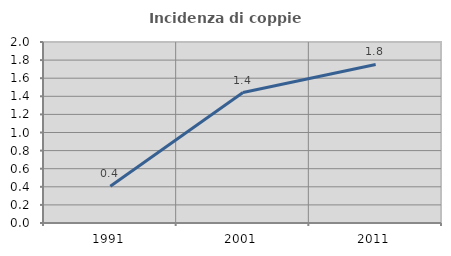
| Category | Incidenza di coppie miste |
|---|---|
| 1991.0 | 0.407 |
| 2001.0 | 1.441 |
| 2011.0 | 1.752 |